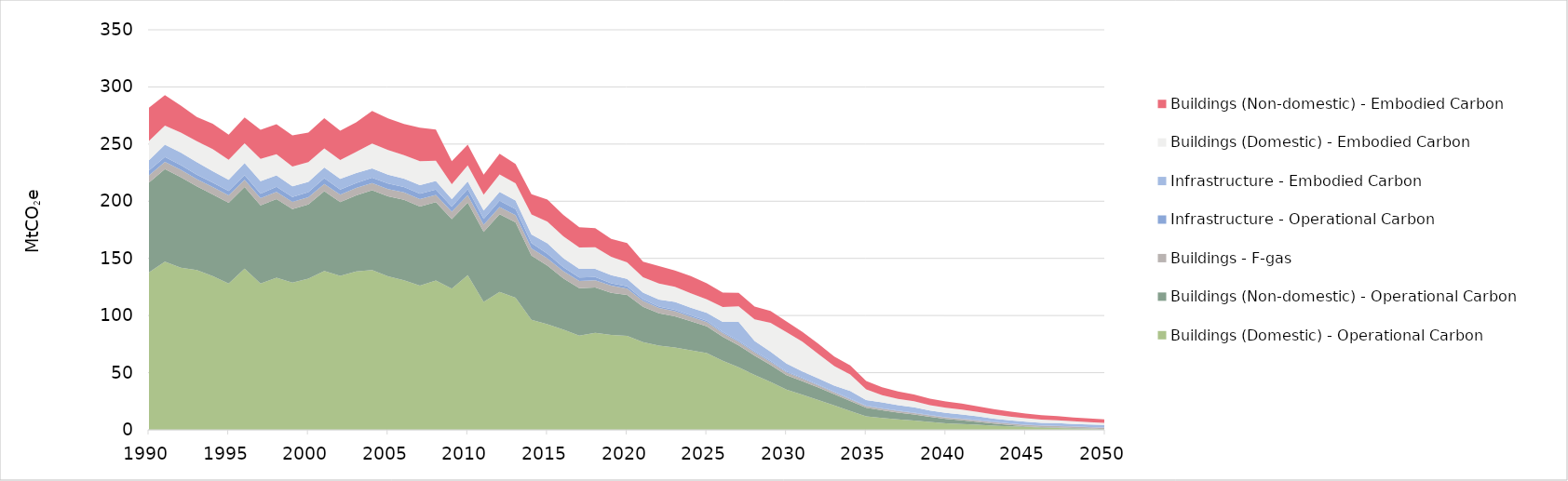
| Category | Buildings (Domestic) - Operational Carbon | Buildings (Non-domestic) - Operational Carbon | Buildings - F-gas | Infrastructure - Operational Carbon | Infrastructure - Embodied Carbon | Buildings (Domestic) - Embodied Carbon | Buildings (Non-domestic) - Embodied Carbon |
|---|---|---|---|---|---|---|---|
| 1990.0 | 137.677 | 78.633 | 6.362 | 4.23 | 8.868 | 17.062 | 28.95 |
| 1991.0 | 147.145 | 80.982 | 6.362 | 4.217 | 10.814 | 16.686 | 26.515 |
| 1992.0 | 141.773 | 79.305 | 6.362 | 4.105 | 10.98 | 17.497 | 23.634 |
| 1993.0 | 139.72 | 73.356 | 6.362 | 3.881 | 10.816 | 18.357 | 21.27 |
| 1994.0 | 134.523 | 71.461 | 6.362 | 3.951 | 10.054 | 19.224 | 22.257 |
| 1995.0 | 127.992 | 70.7 | 6.362 | 3.911 | 9.815 | 17.532 | 21.955 |
| 1996.0 | 141.102 | 71.338 | 6.362 | 4.096 | 10.491 | 17.241 | 22.719 |
| 1997.0 | 127.943 | 68.469 | 6.362 | 3.844 | 10.891 | 19.459 | 25.43 |
| 1998.0 | 133.004 | 68.757 | 6.362 | 4.469 | 10.021 | 18.615 | 26.148 |
| 1999.0 | 128.884 | 64.141 | 6.362 | 4.347 | 9.297 | 17.218 | 27.276 |
| 2000.0 | 132.344 | 64.763 | 6.362 | 4.507 | 9.039 | 17.23 | 25.906 |
| 2001.0 | 138.915 | 69.872 | 6.362 | 4.932 | 9.485 | 16.738 | 26.295 |
| 2002.0 | 134.736 | 64.553 | 6.362 | 4.482 | 9.376 | 16.591 | 25.543 |
| 2003.0 | 138.558 | 66.618 | 6.362 | 4.46 | 8.718 | 18.374 | 26.013 |
| 2004.0 | 139.871 | 69.631 | 6.362 | 4.68 | 8.19 | 21.691 | 28.612 |
| 2005.0 | 134.276 | 70.003 | 6.362 | 4.772 | 7.908 | 21.412 | 27.678 |
| 2006.0 | 130.902 | 70.439 | 6.362 | 4.831 | 7.25 | 20.44 | 27.269 |
| 2007.0 | 126.262 | 69.145 | 6.362 | 4.82 | 7.551 | 20.899 | 29.294 |
| 2008.0 | 130.611 | 68.57 | 6.362 | 4.658 | 7.446 | 17.82 | 27.298 |
| 2009.0 | 123.476 | 60.937 | 6.362 | 4.362 | 6.654 | 13.13 | 20.046 |
| 2010.0 | 135.39 | 63.51 | 6.362 | 5.357 | 6.747 | 13.907 | 18.207 |
| 2011.0 | 111.999 | 61.168 | 6.362 | 5.114 | 7.311 | 13.847 | 17.413 |
| 2012.0 | 120.61 | 67.966 | 6.362 | 5.54 | 7.774 | 15.197 | 18.131 |
| 2013.0 | 115.617 | 65.922 | 6.362 | 5.236 | 7.564 | 14.999 | 16.972 |
| 2014.0 | 96.343 | 56.005 | 6.362 | 4.725 | 7.583 | 17.338 | 17.811 |
| 2015.0 | 92.334 | 51.283 | 6.362 | 4.107 | 9.021 | 19.033 | 19.227 |
| 2016.0 | 87.779 | 44.73 | 6.362 | 3.399 | 7.968 | 18.981 | 18.738 |
| 2017.0 | 82.51 | 41.342 | 6.362 | 3.127 | 7.551 | 18.725 | 17.654 |
| 2018.0 | 84.769 | 39.731 | 6.362 | 2.899 | 7.088 | 18.792 | 16.873 |
| 2019.0 | 82.988 | 36.893 | 6.209 | 2.165 | 7.007 | 16.085 | 15.816 |
| 2020.0 | 82.234 | 35.766 | 5.495 | 2.038 | 6.435 | 14.578 | 16.858 |
| 2021.0 | 76.776 | 30.85 | 5.099 | 1.502 | 5.902 | 13.421 | 13.635 |
| 2022.0 | 73.593 | 28.26 | 4.73 | 1.321 | 6.146 | 13.948 | 15.277 |
| 2023.0 | 72.074 | 27.3 | 4.38 | 1.326 | 6.832 | 13.202 | 14.366 |
| 2024.0 | 69.646 | 25.396 | 3.916 | 1.217 | 6.649 | 12.591 | 15.04 |
| 2025.0 | 67.184 | 23.469 | 3.641 | 1.09 | 7.073 | 11.748 | 14.011 |
| 2026.0 | 60.49 | 20.848 | 3.367 | 0.977 | 8.69 | 13.021 | 12.653 |
| 2027.0 | 54.637 | 19.152 | 3.138 | 1.035 | 16.424 | 13.655 | 11.764 |
| 2028.0 | 48.034 | 16.867 | 2.896 | 0.92 | 9.083 | 18.81 | 11.179 |
| 2029.0 | 41.848 | 14.992 | 2.591 | 0.928 | 7.922 | 25.387 | 10.318 |
| 2030.0 | 35.119 | 12.774 | 2.327 | 0.853 | 6.876 | 27.428 | 9.458 |
| 2031.0 | 30.708 | 11.878 | 2.085 | 0.821 | 5.635 | 25.922 | 8.681 |
| 2032.0 | 26.094 | 10.859 | 1.859 | 0.755 | 5.408 | 21.434 | 8.809 |
| 2033.0 | 21.343 | 9.758 | 1.672 | 0.676 | 5.299 | 16.945 | 8.307 |
| 2034.0 | 16.515 | 8.622 | 1.537 | 0.627 | 6.768 | 14.332 | 7.87 |
| 2035.0 | 11.724 | 7.523 | 1.475 | 0.513 | 4.885 | 9.388 | 7.188 |
| 2036.0 | 10.415 | 6.717 | 1.414 | 0.46 | 5.051 | 6.352 | 6.821 |
| 2037.0 | 9.17 | 5.953 | 1.363 | 0.429 | 4.554 | 5.613 | 6.514 |
| 2038.0 | 8.099 | 5.295 | 1.277 | 0.42 | 4.705 | 5.224 | 5.957 |
| 2039.0 | 6.891 | 4.555 | 1.221 | 0.389 | 3.746 | 4.807 | 5.655 |
| 2040.0 | 5.676 | 3.813 | 1.204 | 0.374 | 3.744 | 4.528 | 5.55 |
| 2041.0 | 5.114 | 3.194 | 1.185 | 0.358 | 3.666 | 4.222 | 5.288 |
| 2042.0 | 4.454 | 2.519 | 1.174 | 0.331 | 3.265 | 3.904 | 4.983 |
| 2043.0 | 3.751 | 1.82 | 1.154 | 0.297 | 2.751 | 3.62 | 4.715 |
| 2044.0 | 3.116 | 1.163 | 1.145 | 0.275 | 2.626 | 3.32 | 4.412 |
| 2045.0 | 2.553 | 0.548 | 1.155 | 0.26 | 2.589 | 3.061 | 4.151 |
| 2046.0 | 2.039 | 0.467 | 1.154 | 0.238 | 2.274 | 2.81 | 3.89 |
| 2047.0 | 1.576 | 0.416 | 1.169 | 0.228 | 2.427 | 2.575 | 3.641 |
| 2048.0 | 1.178 | 0.401 | 1.17 | 0.217 | 2.135 | 2.327 | 3.359 |
| 2049.0 | 0.753 | 0.372 | 1.167 | 0.207 | 2.141 | 2.141 | 3.157 |
| 2050.0 | 0.331 | 0.345 | 1.182 | 0.206 | 2.124 | 1.966 | 2.962 |